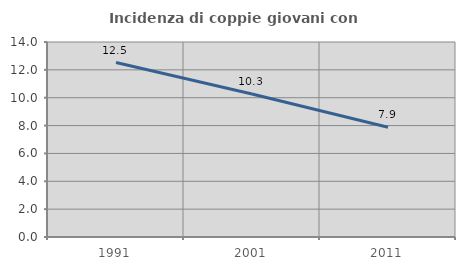
| Category | Incidenza di coppie giovani con figli |
|---|---|
| 1991.0 | 12.527 |
| 2001.0 | 10.267 |
| 2011.0 | 7.885 |